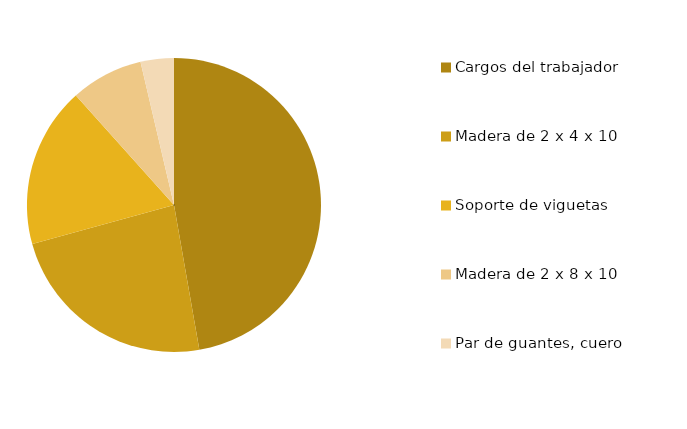
| Category | Series 0 |
|---|---|
| Cargos del trabajador | 200 |
| Madera de 2 x 4 x 10 | 99.4 |
| Soporte de viguetas | 74.7 |
| Madera de 2 x 8 x 10 | 33.75 |
| Par de guantes, cuero | 15.5 |